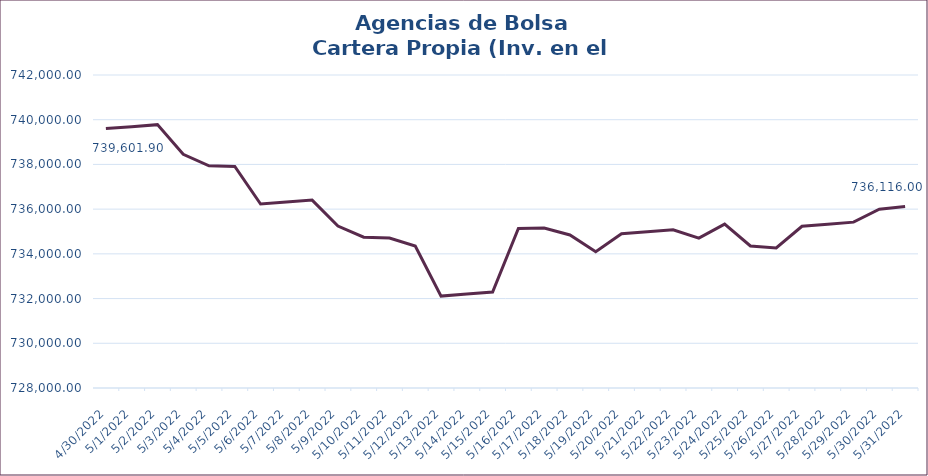
| Category | INV. EXTRANJERO |
|---|---|
| 4/30/22 | 739601.9 |
| 5/1/22 | 739689.9 |
| 5/2/22 | 739779.9 |
| 5/3/22 | 738455.45 |
| 5/4/22 | 737939.9 |
| 5/5/22 | 737909 |
| 5/6/22 | 736227.85 |
| 5/7/22 | 736317.85 |
| 5/8/22 | 736405.85 |
| 5/9/22 | 735244.7 |
| 5/10/22 | 734745.2 |
| 5/11/22 | 734705.95 |
| 5/12/22 | 734347.3 |
| 5/13/22 | 732111.15 |
| 5/14/22 | 732201.15 |
| 5/15/22 | 732292.65 |
| 5/16/22 | 735139.6 |
| 5/17/22 | 735157.85 |
| 5/18/22 | 734845.4 |
| 5/19/22 | 734092.75 |
| 5/20/22 | 734895.5 |
| 5/21/22 | 734985.5 |
| 5/22/22 | 735075.5 |
| 5/23/22 | 734701.5 |
| 5/24/22 | 735332 |
| 5/25/22 | 734353 |
| 5/26/22 | 734262 |
| 5/27/22 | 735235.7 |
| 5/28/22 | 735325.7 |
| 5/29/22 | 735419.2 |
| 5/30/22 | 735997.25 |
| 5/31/22 | 736116 |